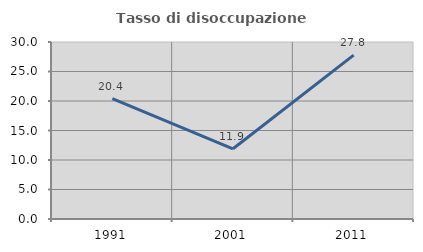
| Category | Tasso di disoccupazione giovanile  |
|---|---|
| 1991.0 | 20.408 |
| 2001.0 | 11.905 |
| 2011.0 | 27.778 |